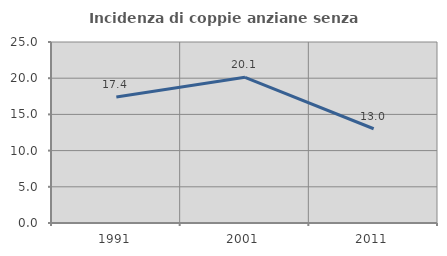
| Category | Incidenza di coppie anziane senza figli  |
|---|---|
| 1991.0 | 17.417 |
| 2001.0 | 20.12 |
| 2011.0 | 13.018 |